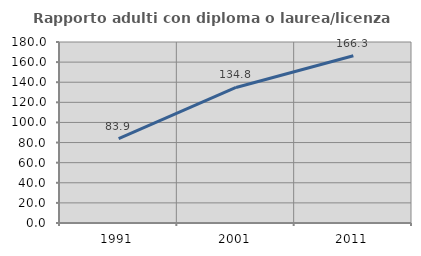
| Category | Rapporto adulti con diploma o laurea/licenza media  |
|---|---|
| 1991.0 | 83.945 |
| 2001.0 | 134.823 |
| 2011.0 | 166.254 |